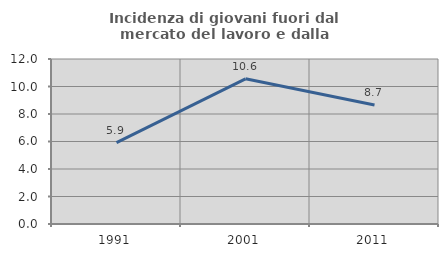
| Category | Incidenza di giovani fuori dal mercato del lavoro e dalla formazione  |
|---|---|
| 1991.0 | 5.917 |
| 2001.0 | 10.559 |
| 2011.0 | 8.661 |